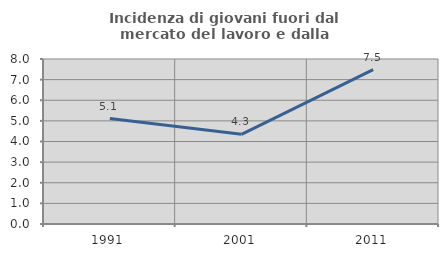
| Category | Incidenza di giovani fuori dal mercato del lavoro e dalla formazione  |
|---|---|
| 1991.0 | 5.113 |
| 2001.0 | 4.348 |
| 2011.0 | 7.488 |